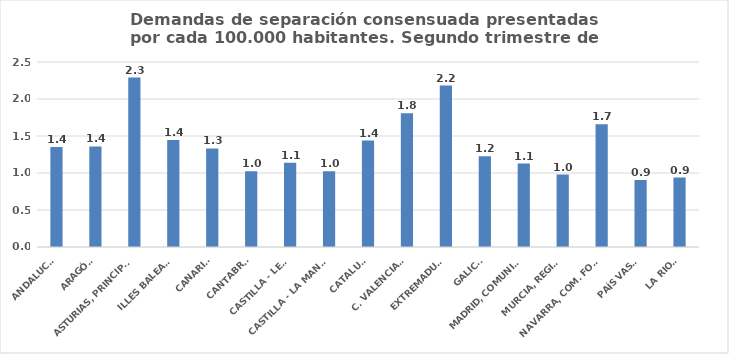
| Category | Series 0 |
|---|---|
| ANDALUCÍA | 1.351 |
| ARAGÓN | 1.358 |
| ASTURIAS, PRINCIPADO | 2.29 |
| ILLES BALEARS | 1.445 |
| CANARIAS | 1.332 |
| CANTABRIA | 1.025 |
| CASTILLA - LEÓN | 1.139 |
| CASTILLA - LA MANCHA | 1.023 |
| CATALUÑA | 1.439 |
| C. VALENCIANA | 1.807 |
| EXTREMADURA | 2.182 |
| GALICIA | 1.227 |
| MADRID, COMUNIDAD | 1.127 |
| MURCIA, REGIÓN | 0.979 |
| NAVARRA, COM. FORAL | 1.658 |
| PAÍS VASCO | 0.906 |
| LA RIOJA | 0.939 |